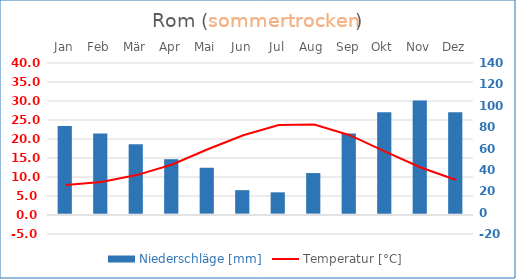
| Category | Niederschläge [mm] |
|---|---|
| Jan | 81 |
| Feb | 74 |
| Mär | 64 |
| Apr | 50 |
| Mai | 42 |
| Jun | 21 |
| Jul | 19 |
| Aug | 37 |
| Sep | 74 |
| Okt | 94 |
| Nov | 105 |
| Dez | 94 |